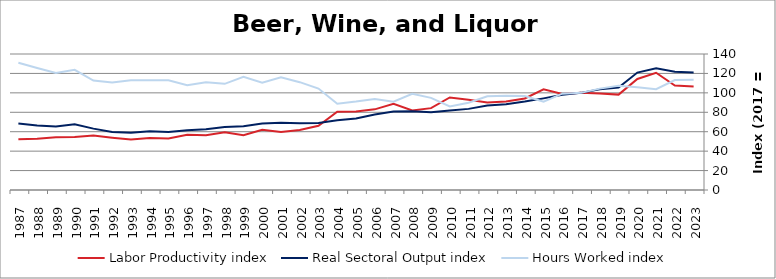
| Category | Labor Productivity index | Real Sectoral Output index | Hours Worked index |
|---|---|---|---|
| 2023.0 | 106.488 | 120.892 | 113.527 |
| 2022.0 | 107.528 | 121.65 | 113.134 |
| 2021.0 | 120.719 | 125.332 | 103.821 |
| 2020.0 | 114.329 | 120.877 | 105.727 |
| 2019.0 | 98.198 | 105.479 | 107.415 |
| 2018.0 | 99.423 | 103.761 | 104.363 |
| 2017.0 | 100 | 100 | 100 |
| 2016.0 | 98.752 | 97.96 | 99.198 |
| 2015.0 | 103.698 | 94.322 | 90.958 |
| 2014.0 | 94.247 | 91.121 | 96.683 |
| 2013.0 | 91.025 | 88.383 | 97.097 |
| 2012.0 | 90.131 | 86.886 | 96.399 |
| 2011.0 | 93.001 | 83.511 | 89.796 |
| 2010.0 | 95.314 | 81.932 | 85.96 |
| 2009.0 | 84.262 | 79.915 | 94.841 |
| 2008.0 | 81.781 | 81.02 | 99.069 |
| 2007.0 | 88.828 | 80.683 | 90.83 |
| 2006.0 | 83.02 | 77.802 | 93.715 |
| 2005.0 | 80.927 | 73.68 | 91.045 |
| 2004.0 | 80.68 | 71.707 | 88.878 |
| 2003.0 | 66.122 | 69.042 | 104.417 |
| 2002.0 | 61.806 | 68.604 | 110.999 |
| 2001.0 | 59.774 | 69.338 | 116.001 |
| 2000.0 | 61.964 | 68.374 | 110.345 |
| 1999.0 | 56.331 | 65.647 | 116.537 |
| 1998.0 | 59.426 | 64.952 | 109.298 |
| 1997.0 | 56.356 | 62.472 | 110.853 |
| 1996.0 | 56.907 | 61.441 | 107.968 |
| 1995.0 | 52.929 | 59.751 | 112.889 |
| 1994.0 | 53.499 | 60.39 | 112.88 |
| 1993.0 | 52.005 | 58.817 | 113.099 |
| 1992.0 | 53.851 | 59.642 | 110.754 |
| 1991.0 | 56.092 | 63.184 | 112.642 |
| 1990.0 | 54.676 | 67.623 | 123.679 |
| 1989.0 | 54.293 | 65.429 | 120.51 |
| 1988.0 | 52.778 | 66.276 | 125.575 |
| 1987.0 | 52.214 | 68.425 | 131.048 |